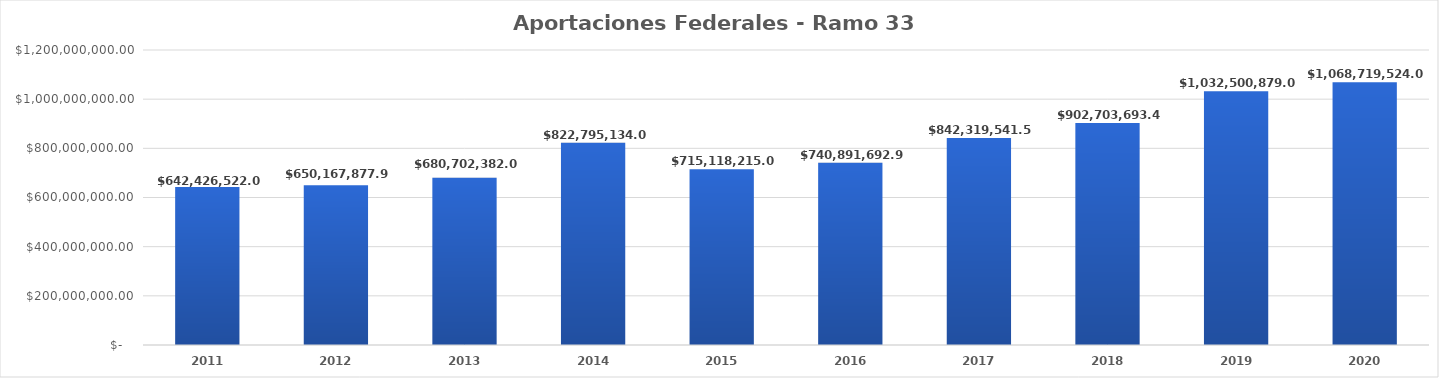
| Category | Aportaciones Federales - Ramo 33 FISM-FORTAMUN |
|---|---|
| 2011.0 | 642426522 |
| 2012.0 | 650167877.96 |
| 2013.0 | 680702382 |
| 2014.0 | 822795134 |
| 2015.0 | 715118215 |
| 2016.0 | 740891692.9 |
| 2017.0 | 842319541.5 |
| 2018.0 | 902703693.48 |
| 2019.0 | 1032500879 |
| 2020.0 | 1068719524 |